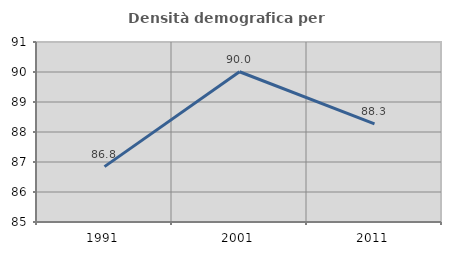
| Category | Densità demografica |
|---|---|
| 1991.0 | 86.845 |
| 2001.0 | 90.009 |
| 2011.0 | 88.269 |